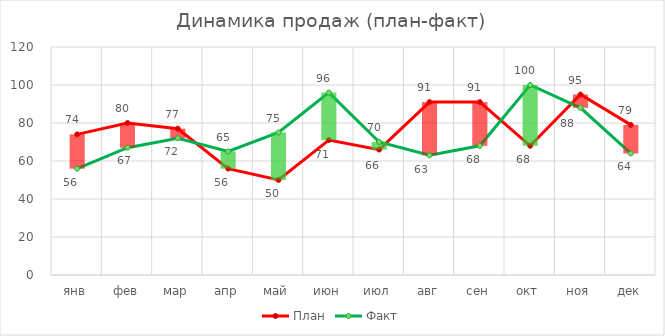
| Category | План | Факт |
|---|---|---|
| янв | 74 | 56 |
| фев | 80 | 67 |
| мар | 77 | 72 |
| апр | 56 | 65 |
| май | 50 | 75 |
| июн | 71 | 96 |
| июл | 66 | 70 |
| авг | 91 | 63 |
| сен | 91 | 68 |
| окт | 68 | 100 |
| ноя | 95 | 88 |
| дек | 79 | 64 |